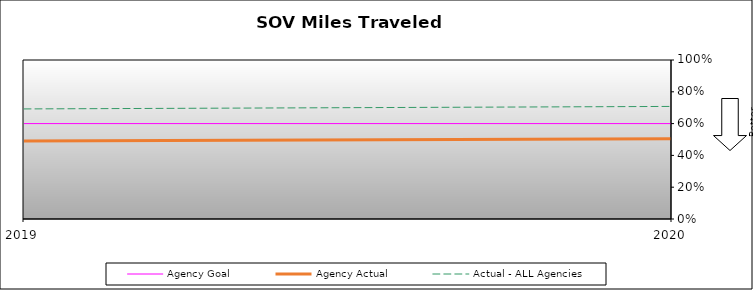
| Category | Agency Goal | Agency Actual | Actual - ALL Agencies |
|---|---|---|---|
| 2019.0 | 0.6 | 0.49 | 0.692 |
| 2020.0 | 0.6 | 0.505 | 0.708 |